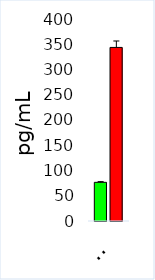
| Category | Control | ASD |
|---|---|---|
| Cas7 | 76.559 | 343.689 |